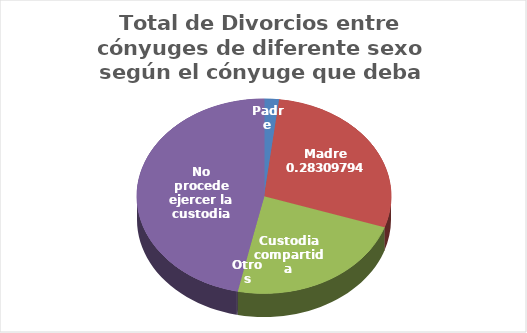
| Category | Series 0 |
|---|---|
| Padre | 1615 |
| Madre | 24114 |
| Custodia compartida | 19670 |
| Otros | 153 |
| No procede ejercer la custodia | 39627 |